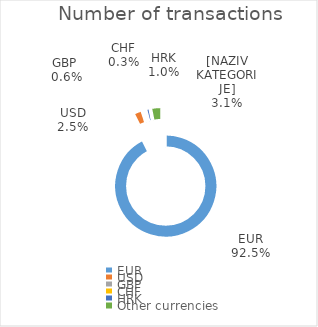
| Category | Number of transactions |
|---|---|
| EUR | 3823462 |
| USD | 104342 |
| GBP | 21901 |
| CHF | 14119 |
| HRK | 40147 |
| Other currencies | 129379 |